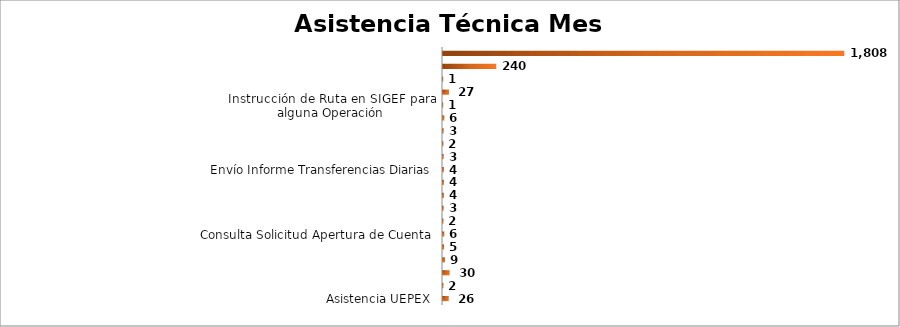
| Category | Cantidad |
|---|---|
| Asistencia UEPEX | 26 |
| Consulta Balance Cuenta Colectora | 2 |
| Consulta Disponibilidad  | 30 |
| Consulta Estatus de Libramiento | 9 |
| Consulta Estatus Transferencia | 5 |
| Consulta Solicitud Apertura de Cuenta | 6 |
| Consulta Solicitud Cambio de RNC | 2 |
| Consulta Solicitud Cierre de Cuenta | 3 |
| Consulta Solicitud Registro/Sustitución de
Firmas | 4 |
| Consulta Solicitud Rol Tesorero Institucional  | 4 |
| Envío Informe Transferencias Diarias | 4 |
| Envío Reporte Medio de Pago por Beneficiario Deductor | 3 |
| Gestión Asignación de Cuota de Pago  | 2 |
| Gestión Vinculación TI a TTP | 3 |
| Identificación de Débitos y/o Créditos | 6 |
| Instrucción de Ruta en SIGEF para alguna Operación | 1 |
| Otros/Info. cuentas bancarias/Info Registro Cuenta SIGEF/ consulta depósito en colectora/ Info.  Requisitos registro en cuentas/Código SWIFT/Info. Débito/ Info. Transferencia | 27 |
| Envío reporte Informe de Reporte de Completada Pagos Programa de Edificaciones Escolares | 1 |
| Solicitud Certificación No Objeción de Pago | 240 |
| Envío de Reporte Estados de Cuenta/Envío de Reporte Movimiento Financiero en Libros | 1808 |